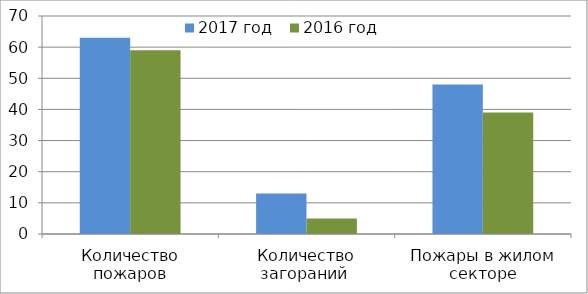
| Category | 2017 год | 2016 год |
|---|---|---|
| Количество пожаров | 63 | 59 |
| Количество загораний  | 13 | 5 |
| Пожары в жилом секторе | 48 | 39 |